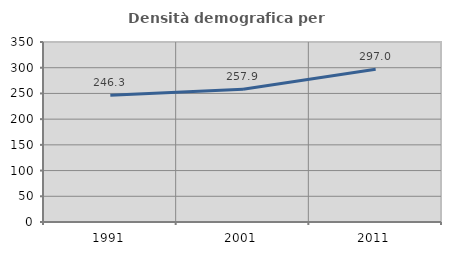
| Category | Densità demografica |
|---|---|
| 1991.0 | 246.287 |
| 2001.0 | 257.934 |
| 2011.0 | 296.973 |